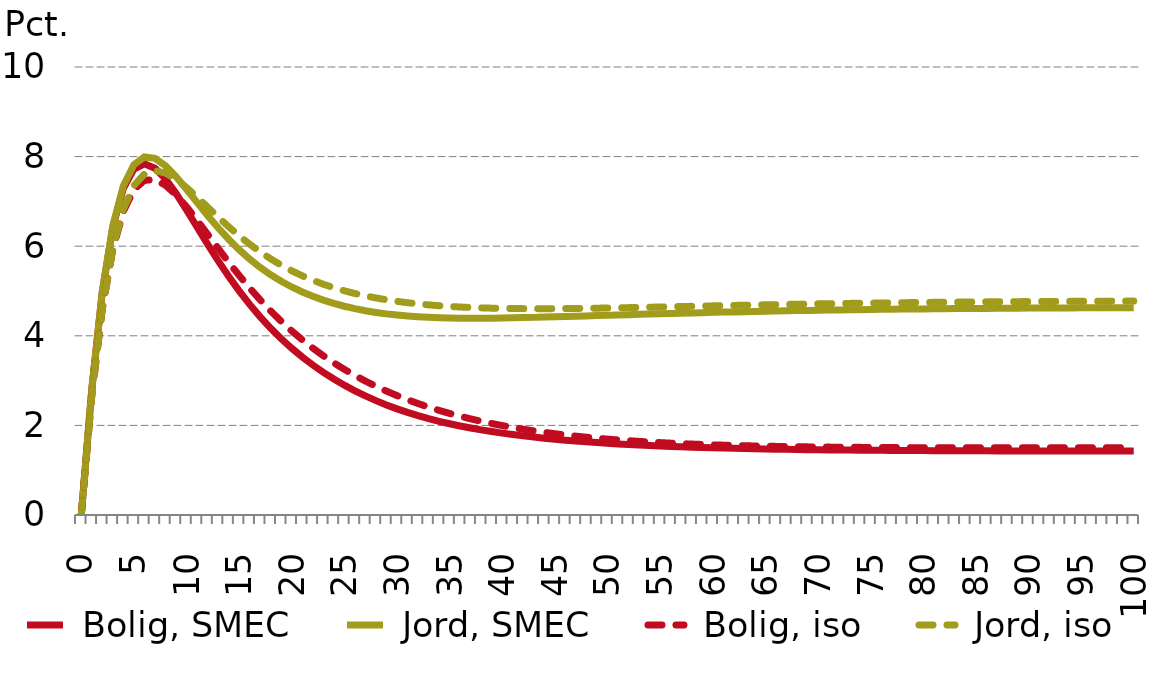
| Category |  Bolig, SMEC |  Jord, SMEC |  Bolig, iso |  Jord, iso |
|---|---|---|---|---|
| 0.0 | 0 | 0 | 0 | 0 |
| nan | 2.807 | 2.807 | 2.66 | 2.66 |
| nan | 4.982 | 4.989 | 4.601 | 4.607 |
| nan | 6.431 | 6.455 | 5.931 | 5.953 |
| nan | 7.293 | 7.348 | 6.78 | 6.83 |
| 5.0 | 7.721 | 7.819 | 7.262 | 7.351 |
| nan | 7.838 | 7.992 | 7.471 | 7.611 |
| nan | 7.741 | 7.96 | 7.485 | 7.685 |
| nan | 7.503 | 7.796 | 7.362 | 7.632 |
| nan | 7.18 | 7.554 | 7.149 | 7.496 |
| 10.0 | 6.813 | 7.272 | 6.881 | 7.31 |
| nan | 6.429 | 6.978 | 6.581 | 7.097 |
| nan | 6.047 | 6.687 | 6.267 | 6.873 |
| nan | 5.678 | 6.411 | 5.952 | 6.65 |
| nan | 5.329 | 6.155 | 5.644 | 6.435 |
| 15.0 | 5.002 | 5.923 | 5.348 | 6.232 |
| nan | 4.701 | 5.713 | 5.066 | 6.045 |
| nan | 4.423 | 5.527 | 4.802 | 5.873 |
| nan | 4.168 | 5.362 | 4.554 | 5.717 |
| nan | 3.935 | 5.217 | 4.323 | 5.577 |
| 20.0 | 3.722 | 5.089 | 4.108 | 5.451 |
| nan | 3.526 | 4.978 | 3.909 | 5.339 |
| nan | 3.348 | 4.881 | 3.725 | 5.239 |
| nan | 3.184 | 4.796 | 3.554 | 5.151 |
| nan | 3.034 | 4.723 | 3.396 | 5.073 |
| 25.0 | 2.897 | 4.66 | 3.25 | 5.004 |
| nan | 2.772 | 4.606 | 3.114 | 4.944 |
| nan | 2.657 | 4.56 | 2.989 | 4.891 |
| nan | 2.553 | 4.521 | 2.873 | 4.845 |
| nan | 2.457 | 4.489 | 2.765 | 4.804 |
| 30.0 | 2.37 | 4.462 | 2.665 | 4.769 |
| nan | 2.29 | 4.441 | 2.573 | 4.739 |
| nan | 2.218 | 4.424 | 2.487 | 4.713 |
| nan | 2.152 | 4.412 | 2.408 | 4.691 |
| nan | 2.092 | 4.402 | 2.335 | 4.672 |
| 35.0 | 2.037 | 4.396 | 2.267 | 4.656 |
| nan | 1.987 | 4.393 | 2.204 | 4.643 |
| nan | 1.942 | 4.391 | 2.146 | 4.632 |
| nan | 1.9 | 4.392 | 2.092 | 4.624 |
| nan | 1.862 | 4.394 | 2.042 | 4.617 |
| 40.0 | 1.827 | 4.397 | 1.996 | 4.612 |
| nan | 1.795 | 4.401 | 1.954 | 4.608 |
| nan | 1.766 | 4.406 | 1.914 | 4.606 |
| nan | 1.739 | 4.411 | 1.878 | 4.605 |
| nan | 1.714 | 4.417 | 1.845 | 4.605 |
| 45.0 | 1.691 | 4.424 | 1.814 | 4.606 |
| nan | 1.67 | 4.43 | 1.786 | 4.608 |
| nan | 1.651 | 4.437 | 1.76 | 4.61 |
| nan | 1.633 | 4.444 | 1.736 | 4.613 |
| nan | 1.616 | 4.451 | 1.714 | 4.617 |
| 50.0 | 1.601 | 4.458 | 1.694 | 4.62 |
| nan | 1.587 | 4.465 | 1.675 | 4.624 |
| nan | 1.574 | 4.472 | 1.658 | 4.629 |
| nan | 1.562 | 4.479 | 1.643 | 4.633 |
| nan | 1.551 | 4.486 | 1.629 | 4.638 |
| 55.0 | 1.54 | 4.492 | 1.616 | 4.643 |
| nan | 1.531 | 4.499 | 1.604 | 4.648 |
| nan | 1.522 | 4.505 | 1.593 | 4.653 |
| nan | 1.514 | 4.511 | 1.583 | 4.658 |
| nan | 1.507 | 4.517 | 1.574 | 4.663 |
| 60.0 | 1.5 | 4.523 | 1.566 | 4.668 |
| nan | 1.494 | 4.529 | 1.559 | 4.673 |
| nan | 1.488 | 4.534 | 1.552 | 4.678 |
| nan | 1.483 | 4.539 | 1.546 | 4.682 |
| nan | 1.478 | 4.544 | 1.541 | 4.687 |
| 65.0 | 1.474 | 4.549 | 1.536 | 4.692 |
| nan | 1.469 | 4.554 | 1.532 | 4.696 |
| nan | 1.466 | 4.558 | 1.528 | 4.7 |
| nan | 1.462 | 4.562 | 1.524 | 4.705 |
| nan | 1.459 | 4.566 | 1.521 | 4.709 |
| 70.0 | 1.456 | 4.57 | 1.518 | 4.712 |
| nan | 1.453 | 4.574 | 1.515 | 4.716 |
| nan | 1.451 | 4.578 | 1.513 | 4.72 |
| nan | 1.449 | 4.581 | 1.511 | 4.723 |
| nan | 1.446 | 4.584 | 1.51 | 4.727 |
| 75.0 | 1.445 | 4.587 | 1.508 | 4.73 |
| nan | 1.443 | 4.59 | 1.507 | 4.733 |
| nan | 1.441 | 4.593 | 1.505 | 4.736 |
| nan | 1.44 | 4.595 | 1.504 | 4.739 |
| nan | 1.438 | 4.598 | 1.504 | 4.742 |
| 80.0 | 1.437 | 4.6 | 1.503 | 4.744 |
| nan | 1.436 | 4.603 | 1.502 | 4.747 |
| nan | 1.435 | 4.605 | 1.502 | 4.749 |
| nan | 1.434 | 4.607 | 1.501 | 4.751 |
| nan | 1.433 | 4.609 | 1.501 | 4.753 |
| 85.0 | 1.432 | 4.61 | 1.501 | 4.755 |
| nan | 1.432 | 4.612 | 1.501 | 4.757 |
| nan | 1.431 | 4.614 | 1.5 | 4.759 |
| nan | 1.43 | 4.615 | 1.5 | 4.761 |
| nan | 1.43 | 4.617 | 1.5 | 4.762 |
| 90.0 | 1.429 | 4.618 | 1.5 | 4.764 |
| nan | 1.429 | 4.619 | 1.5 | 4.765 |
| nan | 1.428 | 4.621 | 1.501 | 4.767 |
| nan | 1.428 | 4.622 | 1.501 | 4.768 |
| nan | 1.428 | 4.623 | 1.501 | 4.769 |
| 95.0 | 1.427 | 4.624 | 1.501 | 4.77 |
| nan | 1.427 | 4.625 | 1.501 | 4.772 |
| nan | 1.427 | 4.626 | 1.501 | 4.773 |
| nan | 1.427 | 4.627 | 1.501 | 4.774 |
| nan | 1.427 | 4.627 | 1.502 | 4.774 |
| 100.0 | 1.426 | 4.628 | 1.502 | 4.775 |